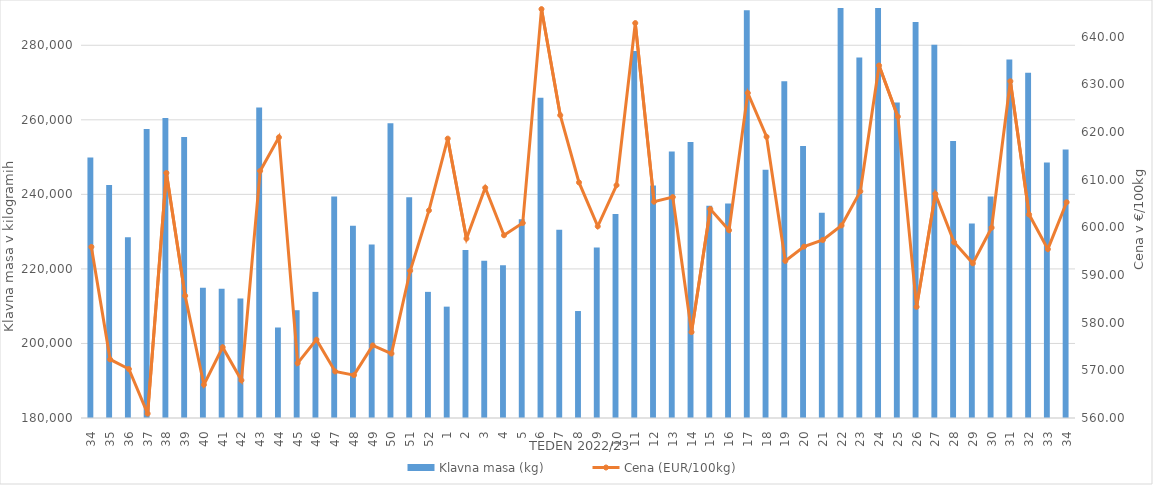
| Category | Klavna masa (kg) |
|---|---|
| 34.0 | 249873 |
| 35.0 | 242516 |
| 36.0 | 228469 |
| 37.0 | 257511 |
| 38.0 | 260481 |
| 39.0 | 255370 |
| 40.0 | 214936 |
| 41.0 | 214672 |
| 42.0 | 212066 |
| 43.0 | 263287 |
| 44.0 | 204280 |
| 45.0 | 208920 |
| 46.0 | 213836 |
| 47.0 | 239417 |
| 48.0 | 231565 |
| 49.0 | 226575 |
| 50.0 | 259073 |
| 51.0 | 239211 |
| 52.0 | 213841 |
| 1.0 | 209877 |
| 2.0 | 225045 |
| 3.0 | 222198 |
| 4.0 | 221002 |
| 5.0 | 233306 |
| 6.0 | 265944 |
| 7.0 | 230531 |
| 8.0 | 208699 |
| 9.0 | 225712 |
| 10.0 | 234762 |
| 11.0 | 278467 |
| 12.0 | 242369 |
| 13.0 | 251507 |
| 14.0 | 254072 |
| 15.0 | 236964 |
| 16.0 | 237552 |
| 17.0 | 289400 |
| 18.0 | 246616 |
| 19.0 | 270374 |
| 20.0 | 252984 |
| 21.0 | 235060 |
| 22.0 | 290816 |
| 23.0 | 276702 |
| 24.0 | 292976 |
| 25.0 | 264669 |
| 26.0 | 286237 |
| 27.0 | 280112 |
| 28.0 | 254336 |
| 29.0 | 232178 |
| 30.0 | 239437 |
| 31.0 | 276163 |
| 32.0 | 272647 |
| 33.0 | 248536 |
| 34.0 | 252050 |